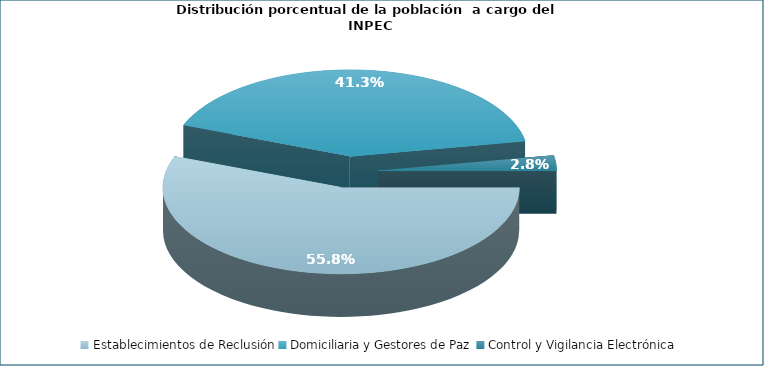
| Category | Series 0 |
|---|---|
| Establecimientos de Reclusión | 96386 |
| Domiciliaria y Gestores de Paz | 71344 |
| Control y Vigilancia Electrónica | 4903 |